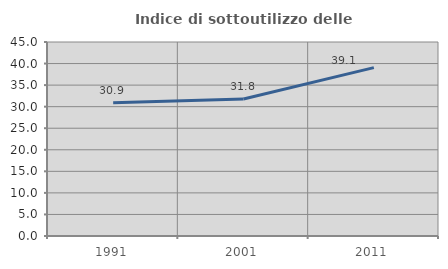
| Category | Indice di sottoutilizzo delle abitazioni  |
|---|---|
| 1991.0 | 30.922 |
| 2001.0 | 31.775 |
| 2011.0 | 39.057 |